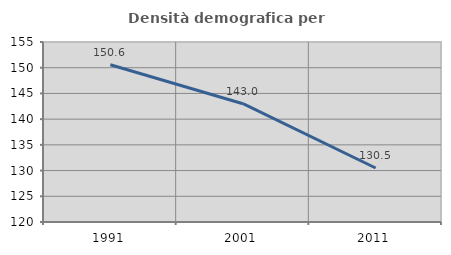
| Category | Densità demografica |
|---|---|
| 1991.0 | 150.588 |
| 2001.0 | 143 |
| 2011.0 | 130.505 |